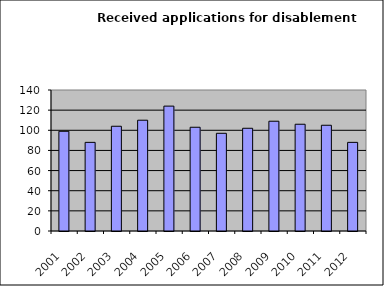
| Category | Series 1 |
|---|---|
| 2001.0 | 99 |
| 2002.0 | 88 |
| 2003.0 | 104 |
| 2004.0 | 110 |
| 2005.0 | 124 |
| 2006.0 | 103 |
| 2007.0 | 97 |
| 2008.0 | 102 |
| 2009.0 | 109 |
| 2010.0 | 106 |
| 2011.0 | 105 |
| 2012.0 | 88 |